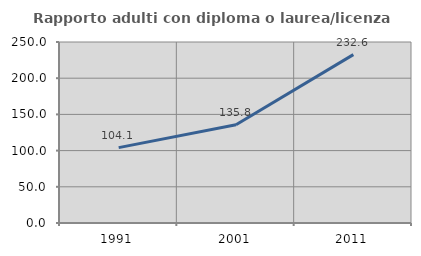
| Category | Rapporto adulti con diploma o laurea/licenza media  |
|---|---|
| 1991.0 | 104.098 |
| 2001.0 | 135.811 |
| 2011.0 | 232.593 |